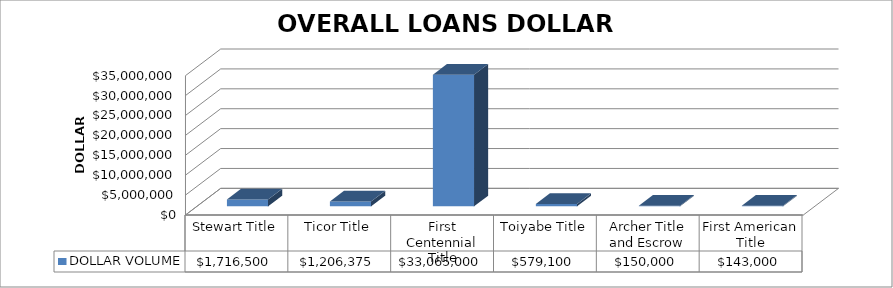
| Category | DOLLAR VOLUME |
|---|---|
| Stewart Title | 1716500 |
| Ticor Title | 1206375 |
| First Centennial Title | 33065000 |
| Toiyabe Title | 579100 |
| Archer Title and Escrow | 150000 |
| First American Title | 143000 |